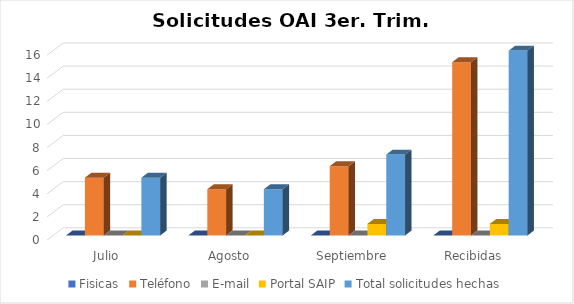
| Category | Fisicas | Teléfono | E-mail | Portal SAIP | Total solicitudes hechas |
|---|---|---|---|---|---|
| Julio | 0 | 5 | 0 | 0 | 5 |
| Agosto | 0 | 4 | 0 | 0 | 4 |
| Septiembre | 0 | 6 | 0 | 1 | 7 |
| Recibidas | 0 | 15 | 0 | 1 | 16 |